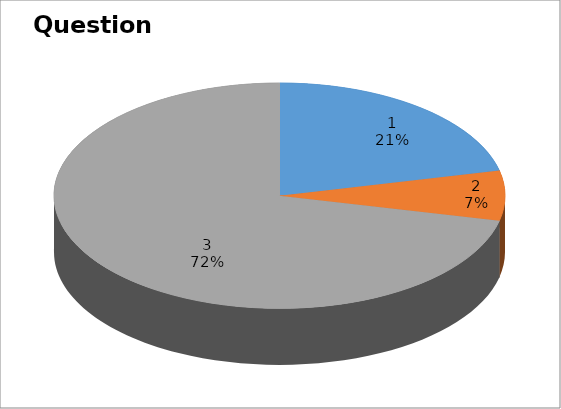
| Category | Series 0 |
|---|---|
| 0 | 3 |
| 1 | 1 |
| 2 | 10 |